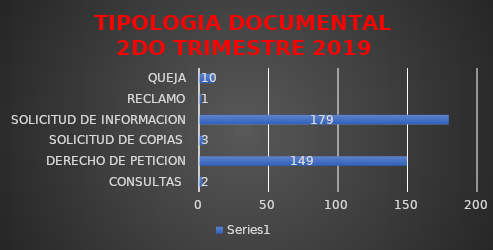
| Category | Series 0 |
|---|---|
| CONSULTAS  | 2 |
| DERECHO DE PETICION | 149 |
| SOLICITUD DE COPIAS  | 3 |
| SOLICITUD DE INFORMACION | 179 |
| RECLAMO | 1 |
| QUEJA | 10 |